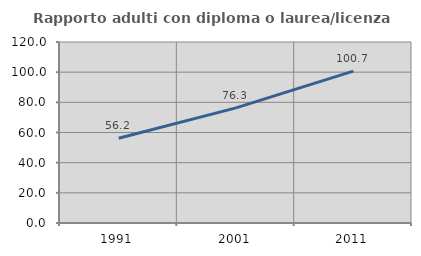
| Category | Rapporto adulti con diploma o laurea/licenza media  |
|---|---|
| 1991.0 | 56.18 |
| 2001.0 | 76.305 |
| 2011.0 | 100.714 |